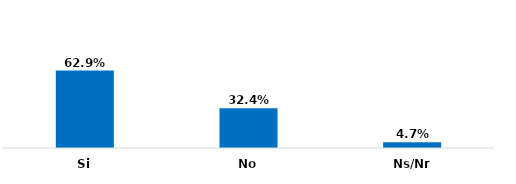
| Category | Series 0 |
|---|---|
| Si | 0.629 |
| No | 0.324 |
| Ns/Nr | 0.047 |